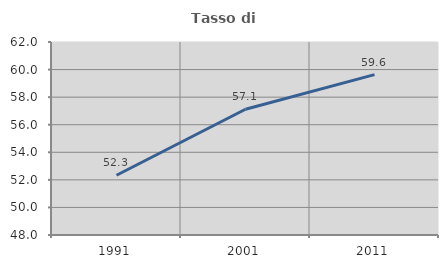
| Category | Tasso di occupazione   |
|---|---|
| 1991.0 | 52.331 |
| 2001.0 | 57.124 |
| 2011.0 | 59.635 |